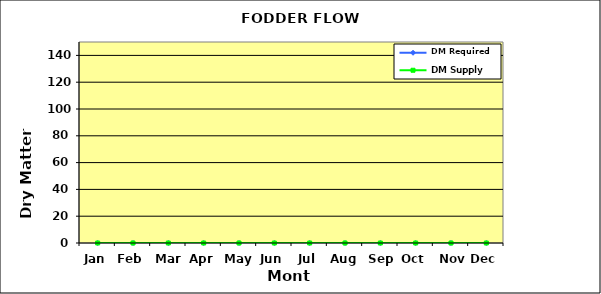
| Category | DM Required | DM Supply |
|---|---|---|
| Jan | 0 | 0 |
| Feb | 0 | 0 |
| Mar | 0 | 0 |
| Apr | 0 | 0 |
| May | 0 | 0 |
| Jun | 0 | 0 |
| Jul | 0 | 0 |
| Aug | 0 | 0 |
| Sep | 0 | 0 |
| Oct | 0 | 0 |
| Nov | 0 | 0 |
| Dec | 0 | 0 |